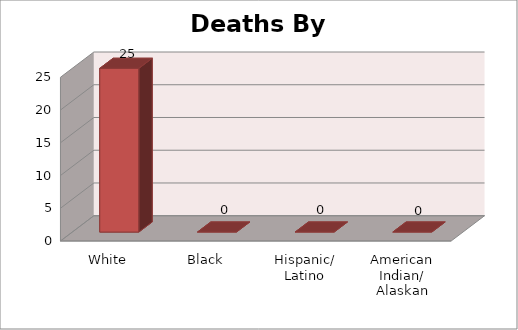
| Category | Series 0 |
|---|---|
| White | 25 |
| Black | 0 |
| Hispanic/
Latino | 0 |
| American Indian/
Alaskan Native | 0 |